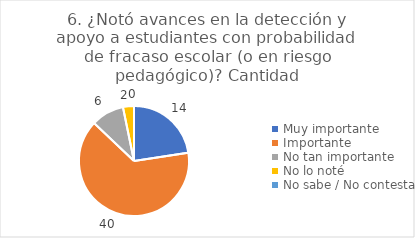
| Category | 6. ¿Notó avances en la detección y apoyo a estudiantes con probabilidad de fracaso escolar (o en riesgo pedagógico)? |
|---|---|
| Muy importante  | 0.226 |
| Importante  | 0.645 |
| No tan importante  | 0.097 |
| No lo noté  | 0.032 |
| No sabe / No contesta | 0 |